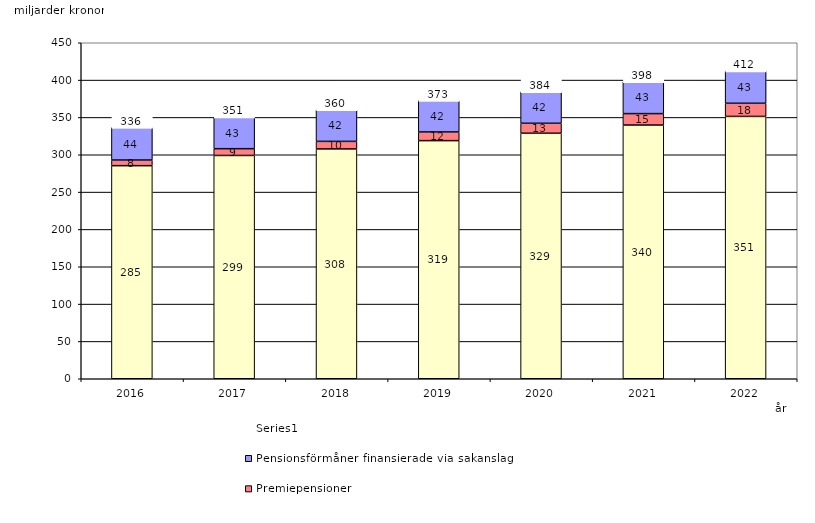
| Category | Inkomstpension och tilläggspension m.m. | Premiepensioner | Pensionsförmåner finansierade via sakanslag | Series 0 |
|---|---|---|---|---|
| 2016.0 | 285.357 | 7.598 | 43.541 | 20 |
| 2017.0 | 299.053 | 9.081 | 42.51 | 20 |
| 2018.0 | 307.804 | 10.112 | 42.346 | 20 |
| 2019.0 | 318.909 | 11.643 | 42.21 | 20 |
| 2020.0 | 328.829 | 13.345 | 42.232 | 20 |
| 2021.0 | 339.801 | 15.318 | 42.712 | 20 |
| 2022.0 | 351.353 | 17.605 | 43.272 | 20 |